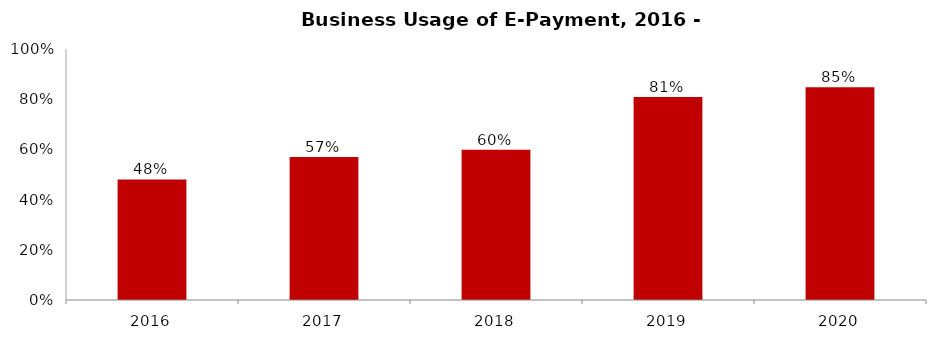
| Category | Business Usage of E-Payment |
|---|---|
| 2016.0 | 0.48 |
| 2017.0 | 0.57 |
| 2018.0 | 0.599 |
| 2019.0 | 0.808 |
| 2020.0 | 0.848 |